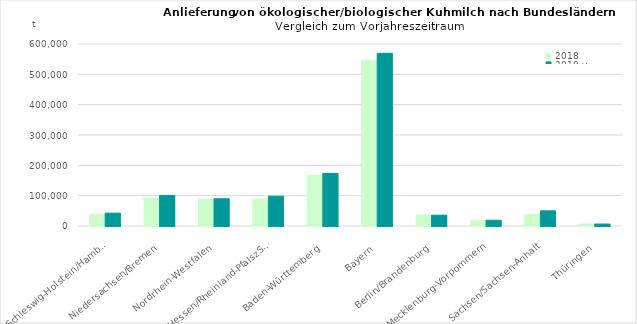
| Category | 2018 | 2019 v |
|---|---|---|
| Schleswig-Holstein/Hamburg | 37798.973 | 42355.016 |
| Niedersachsen/Bremen | 92013.709 | 100495.385 |
| Nordrhein-Westfalen | 87458.527 | 89871.708 |
| Hessen/Rheinland-PfalszSaarland | 88638.82 | 98403.929 |
| Baden-Württemberg | 167284.811 | 173162.245 |
| Bayern | 545524.044 | 569363.568 |
| Berlin/Brandenburg | 36421.415 | 35619.232 |
| Mecklenburg-Vorpommern | 17957.076 | 18991.369 |
| Sachsen/Sachsen-Anhalt | 38103.206 | 49999.77 |
| Thüringen | 6620.003 | 6479.797 |